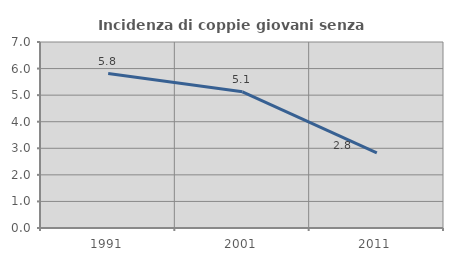
| Category | Incidenza di coppie giovani senza figli |
|---|---|
| 1991.0 | 5.811 |
| 2001.0 | 5.124 |
| 2011.0 | 2.829 |